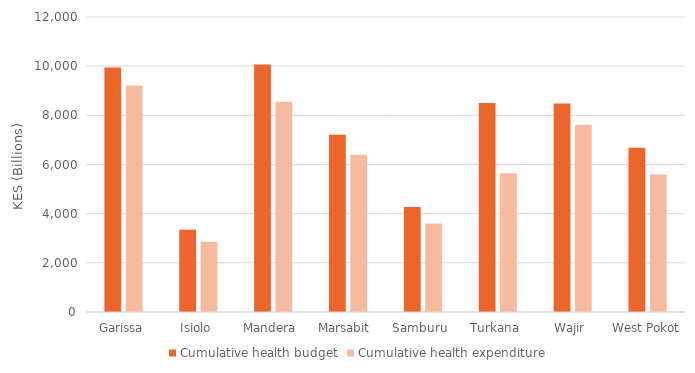
| Category | Cumulative health budget | Cumulative health expenditure |
|---|---|---|
| Garissa | 9946.3 | 9216.56 |
| Isiolo | 3348.9 | 2857.37 |
| Mandera  | 10064.66 | 8556.87 |
| Marsabit  | 7209.07 | 6393.9 |
| Samburu  | 4275.12 | 3597.03 |
| Turkana  | 8502.33 | 5644.6 |
| Wajir  | 8482.35 | 7614.86 |
| West Pokot | 6682.57 | 5593.58 |